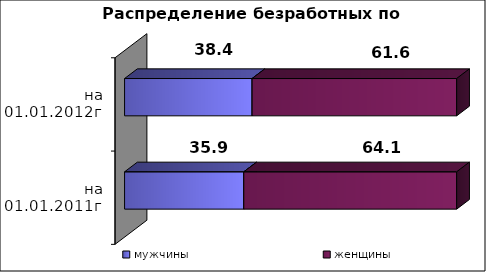
| Category | мужчины  | женщины  |
|---|---|---|
| на 01.01.2011г. | 35.9 | 64.1 |
| на 01.01.2012г. | 38.4 | 61.6 |